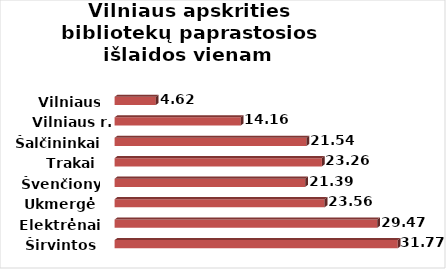
| Category | Series 0 |
|---|---|
| Širvintos | 31.769 |
| Elektrėnai | 29.474 |
| Ukmergė | 23.564 |
| Švenčionys | 21.391 |
| Trakai | 23.262 |
| Šalčininkai | 21.541 |
| Vilniaus r. | 14.162 |
| Vilniaus m. | 4.625 |